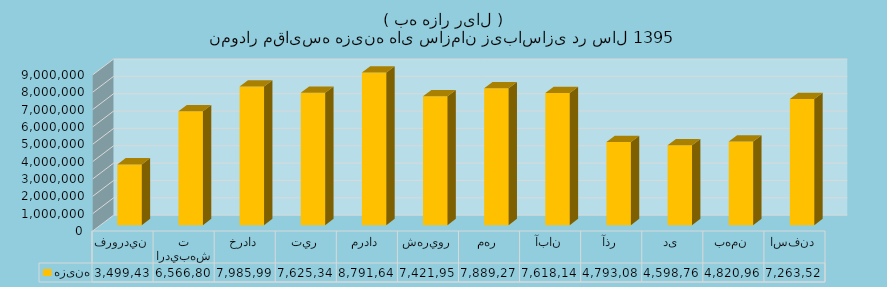
| Category | هزینه |
|---|---|
| فروردين  | 3499436 |
| ارديبهشت | 6566800 |
| خرداد | 7985990 |
| تير | 7625340 |
| مرداد | 8791641 |
| شهريور | 7421952 |
| مهر | 7889270 |
| آبان | 7618148 |
| آذر | 4793080 |
| دی | 4598760 |
| بهمن | 4820960 |
| اسفند | 7263525 |